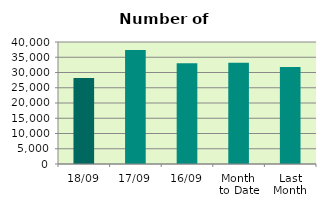
| Category | Series 0 |
|---|---|
| 18/09 | 28220 |
| 17/09 | 37366 |
| 16/09 | 33056 |
| Month 
to Date | 33206.154 |
| Last
Month | 31813.182 |